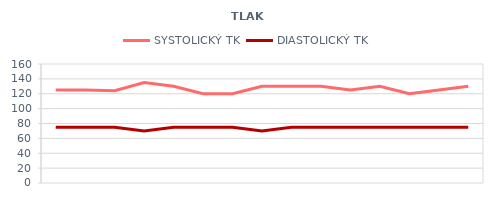
| Category | SYSTOLICKÝ TK | DIASTOLICKÝ TK |
|---|---|---|
| 6/1/12 | 125 | 75 |
| 6/2/12 | 125 | 75 |
| 6/3/12 | 124 | 75 |
| 6/4/12 | 135 | 70 |
| 6/5/12 | 130 | 75 |
| 6/6/12 | 120 | 75 |
| 6/7/12 | 120 | 75 |
| 6/8/12 | 130 | 70 |
| 6/9/12 | 130 | 75 |
| 6/10/12 | 130 | 75 |
| 6/11/12 | 125 | 75 |
| 6/12/12 | 130 | 75 |
| 6/13/12 | 120 | 75 |
| 6/14/12 | 125 | 75 |
| 6/15/12 | 130 | 75 |